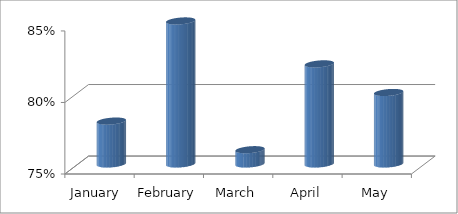
| Category | ACCURACY |
|---|---|
| January  | 0.78 |
| February | 0.85 |
| March | 0.76 |
| April | 0.82 |
| May | 0.8 |